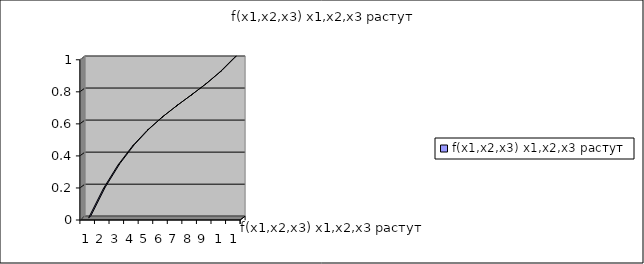
| Category | f(x1,x2,x3) x1,x2,x3 растут |
|---|---|
| 0 | 0 |
| 1 | 0.181 |
| 2 | 0.328 |
| 3 | 0.447 |
| 4 | 0.544 |
| 5 | 0.625 |
| 6 | 0.696 |
| 7 | 0.763 |
| 8 | 0.832 |
| 9 | 0.909 |
| 10 | 1 |